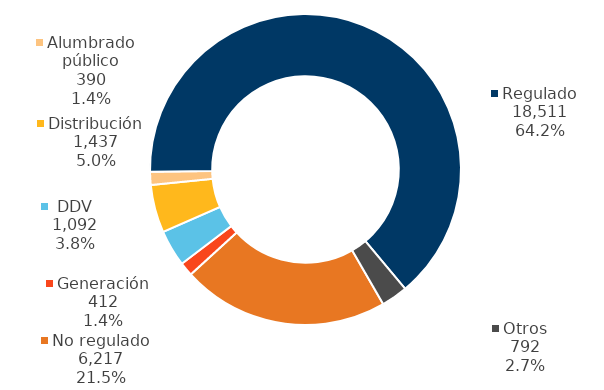
| Category | dic-2021 |
|---|---|
| No regulado | 6217 |
| Generación | 412 |
| DDV | 1092 |
| Distribución | 1437 |
| Alumbrado público | 390 |
| Regulado | 18511 |
| Otros | 792 |